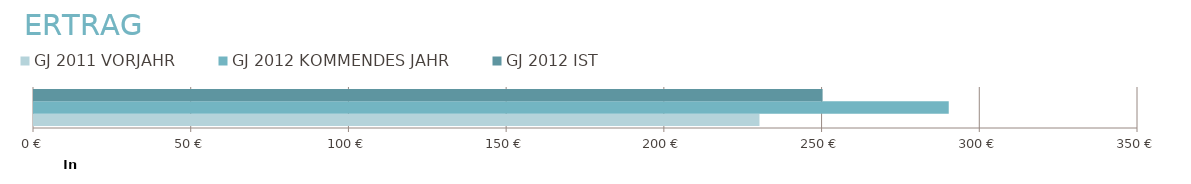
| Category | GJ 2011 | GJ 2012 |
|---|---|---|
| 0 | 230000 | 250000 |